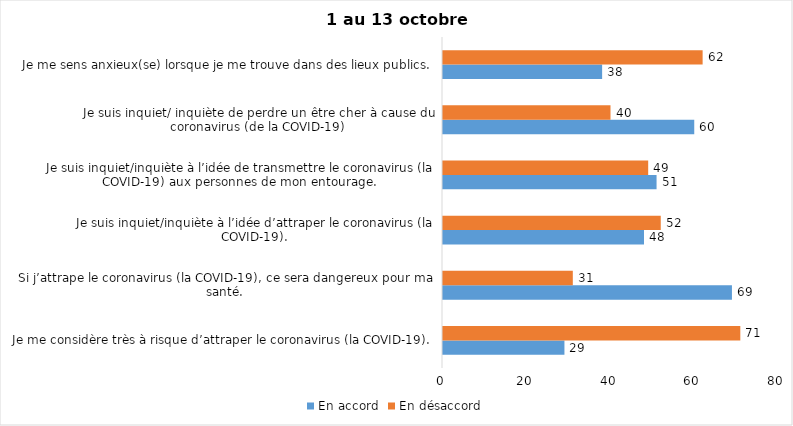
| Category | En accord | En désaccord |
|---|---|---|
| Je me considère très à risque d’attraper le coronavirus (la COVID-19). | 29 | 71 |
| Si j’attrape le coronavirus (la COVID-19), ce sera dangereux pour ma santé. | 69 | 31 |
| Je suis inquiet/inquiète à l’idée d’attraper le coronavirus (la COVID-19). | 48 | 52 |
| Je suis inquiet/inquiète à l’idée de transmettre le coronavirus (la COVID-19) aux personnes de mon entourage. | 51 | 49 |
| Je suis inquiet/ inquiète de perdre un être cher à cause du coronavirus (de la COVID-19) | 60 | 40 |
| Je me sens anxieux(se) lorsque je me trouve dans des lieux publics. | 38 | 62 |